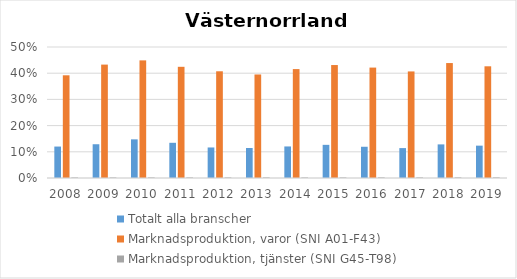
| Category | Totalt alla branscher | Marknadsproduktion, varor (SNI A01-F43) | Marknadsproduktion, tjänster (SNI G45-T98) |
|---|---|---|---|
| 2008 | 0.12 | 0.392 | 0.002 |
| 2009 | 0.129 | 0.433 | 0.002 |
| 2010 | 0.147 | 0.449 | 0.002 |
| 2011 | 0.134 | 0.424 | 0.002 |
| 2012 | 0.117 | 0.407 | 0.002 |
| 2013 | 0.115 | 0.395 | 0.002 |
| 2014 | 0.12 | 0.416 | 0.002 |
| 2015 | 0.127 | 0.431 | 0.002 |
| 2016 | 0.119 | 0.421 | 0.003 |
| 2017 | 0.114 | 0.407 | 0.003 |
| 2018 | 0.128 | 0.439 | 0.003 |
| 2019 | 0.123 | 0.426 | 0.003 |